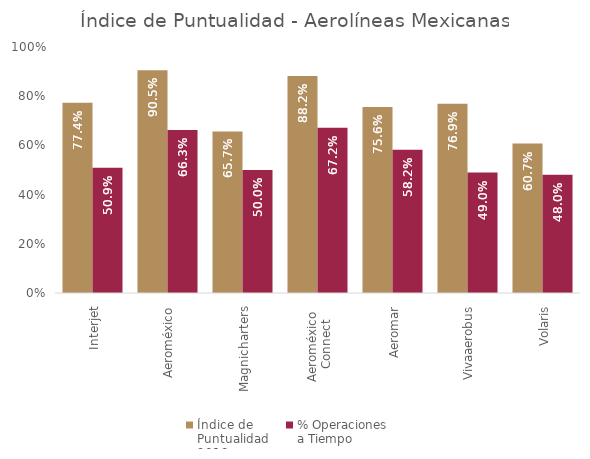
| Category | Índice de 
Puntualidad
2019 | % Operaciones 
a Tiempo |
|---|---|---|
| Interjet | 0.774 | 0.509 |
| Aeroméxico | 0.905 | 0.663 |
| Magnicharters | 0.657 | 0.5 |
| Aeroméxico 
Connect | 0.882 | 0.672 |
| Aeromar | 0.756 | 0.582 |
| Vivaaerobus | 0.769 | 0.49 |
| Volaris | 0.607 | 0.48 |